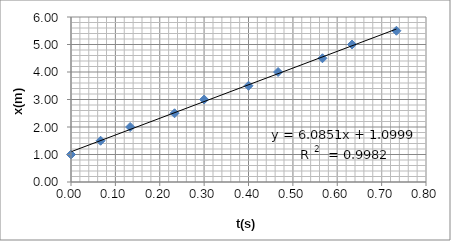
| Category | Series 0 |
|---|---|
| 0.0 | 1 |
| 0.06666666666666667 | 1.5 |
| 0.13333333333333333 | 2 |
| 0.23333333333333334 | 2.5 |
| 0.3 | 3 |
| 0.4 | 3.5 |
| 0.4666666666666667 | 4 |
| 0.5666666666666667 | 4.5 |
| 0.6333333333333333 | 5 |
| 0.7333333333333333 | 5.5 |